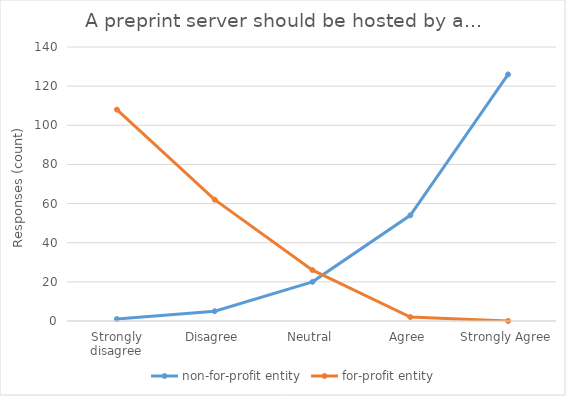
| Category | non-for-profit entity | for-profit entity |
|---|---|---|
| Strongly disagree | 1 | 108 |
| Disagree | 5 | 62 |
| Neutral | 20 | 26 |
| Agree | 54 | 2 |
| Strongly Agree | 126 | 0 |